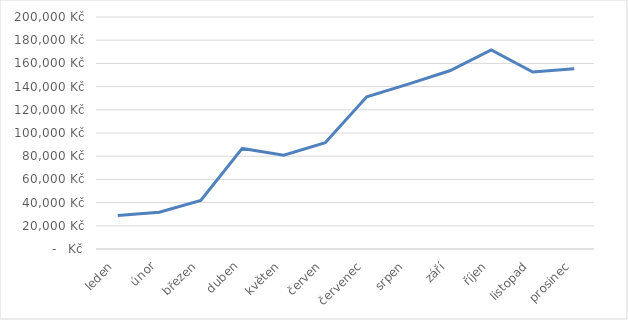
| Category | Series 0 |
|---|---|
| leden | 28889 |
| únor | 31687 |
| březen | 41907 |
| duben | 86728 |
| květen | 80914 |
| červen | 91617 |
| červenec | 131259 |
| srpen | 142097 |
| září | 153662 |
| říjen | 171659 |
| listopad | 152613 |
| prosinec | 155297 |